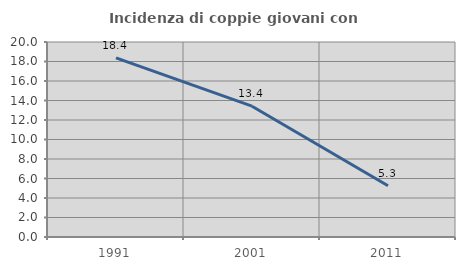
| Category | Incidenza di coppie giovani con figli |
|---|---|
| 1991.0 | 18.367 |
| 2001.0 | 13.418 |
| 2011.0 | 5.252 |